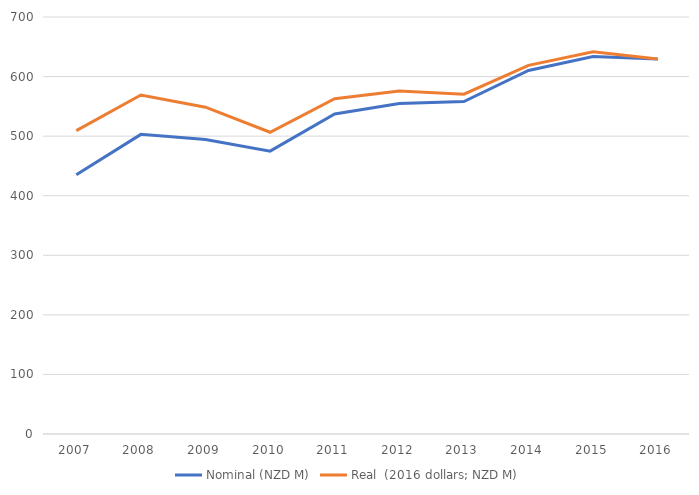
| Category | Nominal (NZD M) | Real  (2016 dollars; NZD M) |
|---|---|---|
| 2007 | 435.216 | 509.208 |
| 2008 | 502.976 | 569.138 |
| 2009 | 494.477 | 548.55 |
| 2010 | 474.864 | 506.531 |
| 2011 | 537.144 | 562.833 |
| 2012 | 554.594 | 575.934 |
| 2013 | 558.055 | 570.402 |
| 2014 | 610.304 | 618.856 |
| 2015 | 633.544 | 641.78 |
| 2016 | 629.316 | 629.316 |